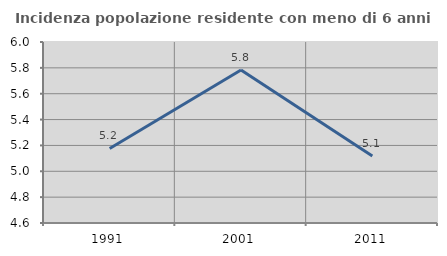
| Category | Incidenza popolazione residente con meno di 6 anni |
|---|---|
| 1991.0 | 5.177 |
| 2001.0 | 5.783 |
| 2011.0 | 5.118 |